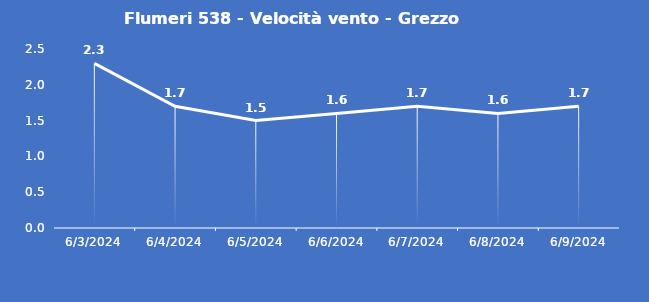
| Category | Flumeri 538 - Velocità vento - Grezzo (m/s) |
|---|---|
| 6/3/24 | 2.3 |
| 6/4/24 | 1.7 |
| 6/5/24 | 1.5 |
| 6/6/24 | 1.6 |
| 6/7/24 | 1.7 |
| 6/8/24 | 1.6 |
| 6/9/24 | 1.7 |